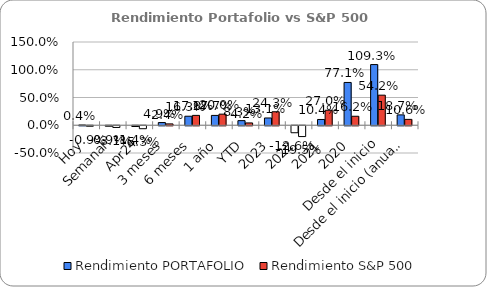
| Category | Rendimiento PORTAFOLIO | Rendimiento S&P 500 |
|---|---|---|
| Hoy | 0.004 | -0.009 |
| Semanal | -0.009 | -0.031 |
| Abr24 | -0.014 | -0.053 |
| 3 meses | 0.049 | 0.024 |
| 6 meses | 0.163 | 0.178 |
| 1 año | 0.177 | 0.2 |
| YTD | 0.083 | 0.042 |
| 2023 | 0.131 | 0.243 |
| 2022 | -0.126 | -0.195 |
| 2021 | 0.104 | 0.27 |
| 2020 | 0.771 | 0.162 |
| Desde el inicio | 1.093 | 0.542 |
| Desde el inicio (anual) | 0.187 | 0.106 |